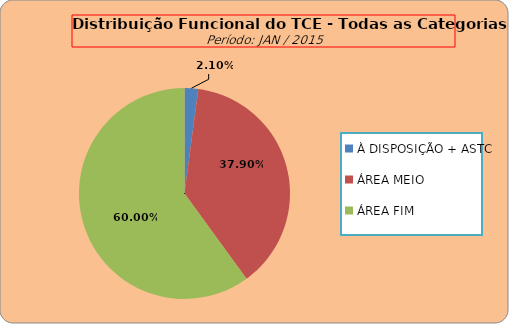
| Category | ÁREAS DE ATUAÇÃO |
|---|---|
| À DISPOSIÇÃO + ASTC | 11 |
| ÁREA MEIO | 199 |
| ÁREA FIM | 315 |